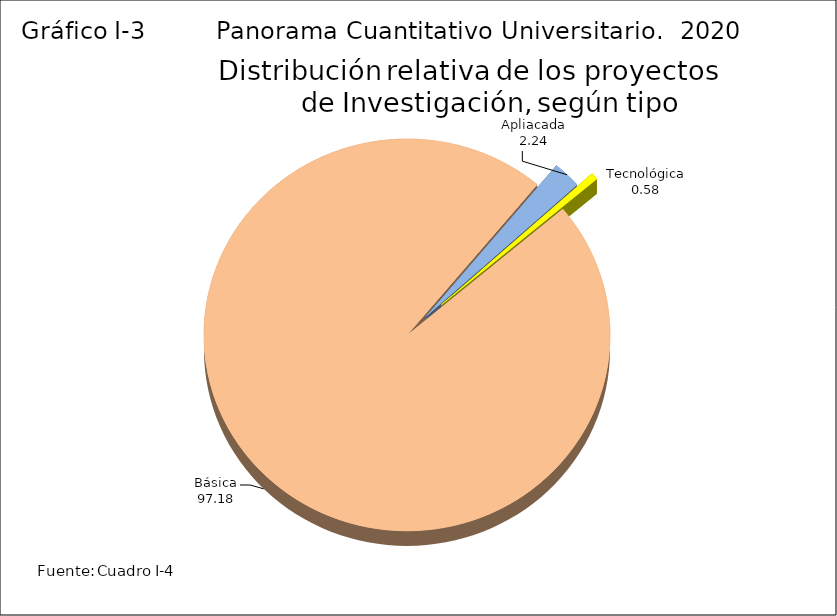
| Category | Series 3 |
|---|---|
| Básica | 97.18 |
| Apliacada | 2.24 |
| Tecnológica | 0.58 |